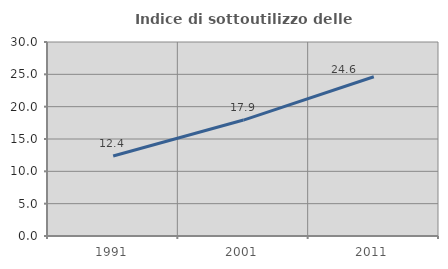
| Category | Indice di sottoutilizzo delle abitazioni  |
|---|---|
| 1991.0 | 12.363 |
| 2001.0 | 17.929 |
| 2011.0 | 24.625 |